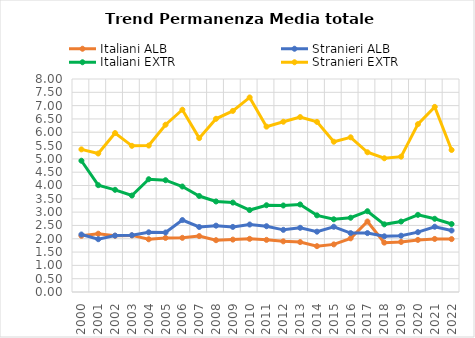
| Category | Italiani ALB | Stranieri ALB | Italiani EXTR | Stranieri EXTR |
|---|---|---|---|---|
| 2000.0 | 2.109 | 2.16 | 4.93 | 5.356 |
| 2001.0 | 2.189 | 1.983 | 4.011 | 5.201 |
| 2002.0 | 2.113 | 2.118 | 3.838 | 5.969 |
| 2003.0 | 2.126 | 2.133 | 3.623 | 5.49 |
| 2004.0 | 1.98 | 2.243 | 4.236 | 5.501 |
| 2005.0 | 2.032 | 2.234 | 4.198 | 6.282 |
| 2006.0 | 2.034 | 2.702 | 3.962 | 6.846 |
| 2007.0 | 2.1 | 2.441 | 3.605 | 5.779 |
| 2008.0 | 1.946 | 2.492 | 3.399 | 6.506 |
| 2009.0 | 1.968 | 2.445 | 3.358 | 6.801 |
| 2010.0 | 1.997 | 2.535 | 3.078 | 7.308 |
| 2011.0 | 1.958 | 2.471 | 3.258 | 6.211 |
| 2012.0 | 1.902 | 2.334 | 3.249 | 6.395 |
| 2013.0 | 1.875 | 2.411 | 3.287 | 6.57 |
| 2014.0 | 1.722 | 2.266 | 2.879 | 6.39 |
| 2015.0 | 1.788 | 2.45 | 2.731 | 5.644 |
| 2016.0 | 2.015 | 2.212 | 2.789 | 5.81 |
| 2017.0 | 2.647 | 2.212 | 3.034 | 5.248 |
| 2018.0 | 1.854 | 2.092 | 2.542 | 5.023 |
| 2019.0 | 1.881 | 2.114 | 2.647 | 5.084 |
| 2020.0 | 1.957 | 2.247 | 2.897 | 6.303 |
| 2021.0 | 1.993 | 2.452 | 2.75 | 6.952 |
| 2022.0 | 1.987 | 2.31 | 2.553 | 5.335 |